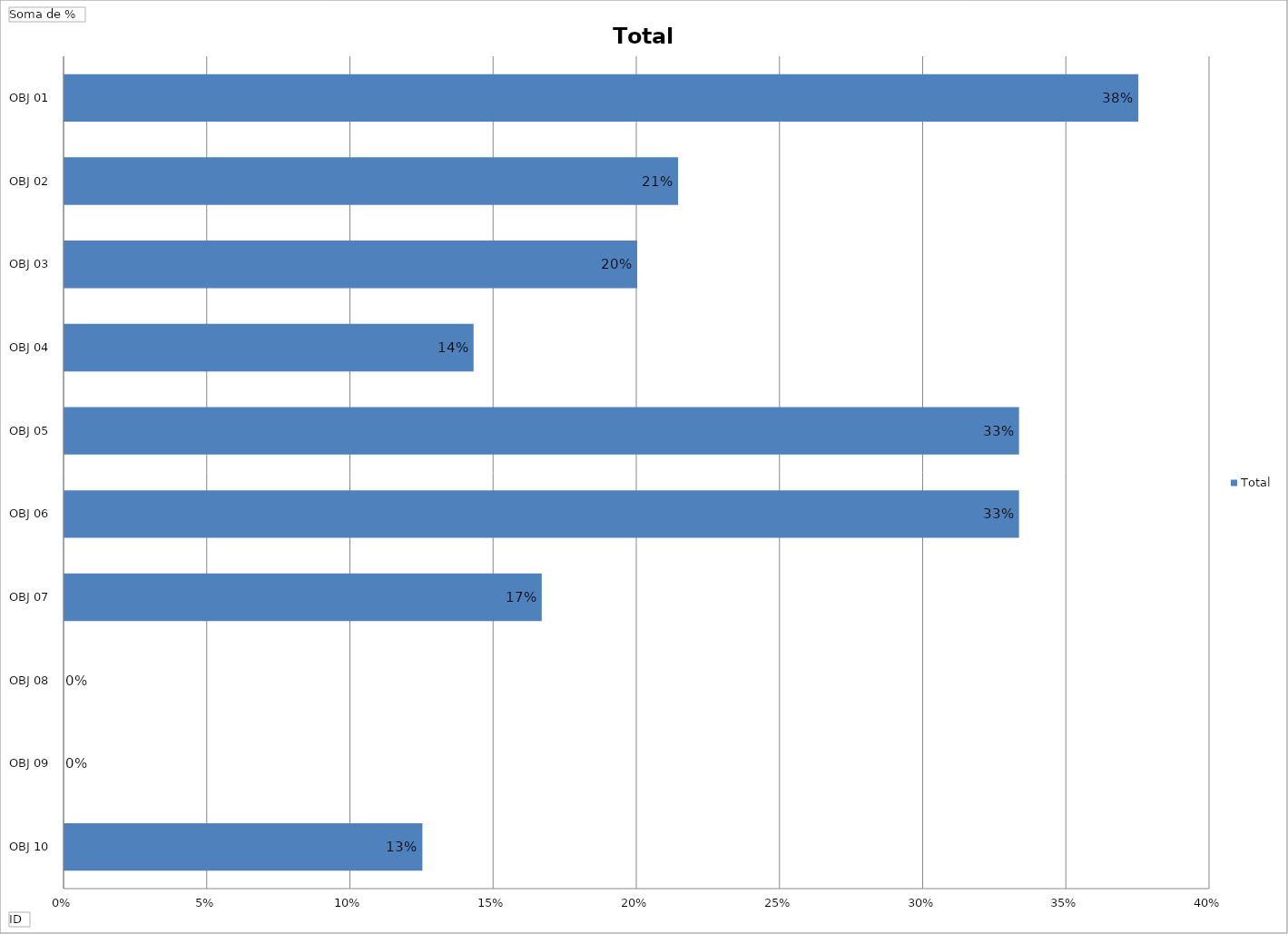
| Category | Total |
|---|---|
| OBJ 10 | 0.125 |
| OBJ 09 | 0 |
| OBJ 08 | 0 |
| OBJ 07 | 0.167 |
| OBJ 06 | 0.333 |
| OBJ 05 | 0.333 |
| OBJ 04 | 0.143 |
| OBJ 03 | 0.2 |
| OBJ 02 | 0.214 |
| OBJ 01 | 0.375 |